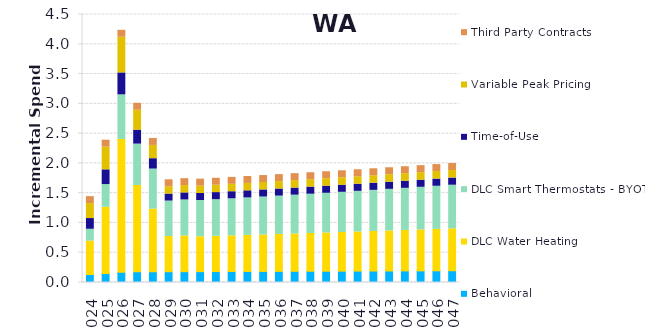
| Category | Behavioral | DLC Water Heating | DLC Smart Thermostats - BYOT | Time-of-Use | Variable Peak Pricing | Third Party Contracts |
|---|---|---|---|---|---|---|
| 2024.0 | 0.134 | 0.562 | 0.198 | 0.18 | 0.251 | 0.117 |
| 2025.0 | 0.15 | 1.113 | 0.38 | 0.248 | 0.381 | 0.117 |
| 2026.0 | 0.172 | 2.23 | 0.749 | 0.368 | 0.599 | 0.117 |
| 2027.0 | 0.18 | 1.448 | 0.695 | 0.234 | 0.334 | 0.117 |
| 2028.0 | 0.18 | 1.052 | 0.673 | 0.174 | 0.223 | 0.117 |
| 2029.0 | 0.181 | 0.59 | 0.596 | 0.118 | 0.123 | 0.117 |
| 2030.0 | 0.182 | 0.599 | 0.605 | 0.118 | 0.123 | 0.117 |
| 2031.0 | 0.183 | 0.586 | 0.608 | 0.118 | 0.124 | 0.117 |
| 2032.0 | 0.183 | 0.592 | 0.615 | 0.118 | 0.124 | 0.117 |
| 2033.0 | 0.184 | 0.599 | 0.622 | 0.119 | 0.124 | 0.117 |
| 2034.0 | 0.185 | 0.606 | 0.629 | 0.119 | 0.124 | 0.117 |
| 2035.0 | 0.186 | 0.613 | 0.637 | 0.119 | 0.124 | 0.117 |
| 2036.0 | 0.187 | 0.62 | 0.644 | 0.119 | 0.125 | 0.117 |
| 2037.0 | 0.188 | 0.627 | 0.652 | 0.119 | 0.125 | 0.117 |
| 2038.0 | 0.189 | 0.634 | 0.659 | 0.119 | 0.125 | 0.117 |
| 2039.0 | 0.19 | 0.642 | 0.667 | 0.119 | 0.125 | 0.117 |
| 2040.0 | 0.191 | 0.649 | 0.675 | 0.119 | 0.125 | 0.117 |
| 2041.0 | 0.192 | 0.657 | 0.683 | 0.119 | 0.126 | 0.117 |
| 2042.0 | 0.192 | 0.664 | 0.691 | 0.12 | 0.126 | 0.117 |
| 2043.0 | 0.193 | 0.672 | 0.699 | 0.12 | 0.126 | 0.117 |
| 2044.0 | 0.194 | 0.68 | 0.707 | 0.12 | 0.126 | 0.117 |
| 2045.0 | 0.195 | 0.688 | 0.715 | 0.12 | 0.126 | 0.117 |
| 2046.0 | 0.196 | 0.696 | 0.724 | 0.12 | 0.127 | 0.117 |
| 2047.0 | 0.197 | 0.704 | 0.732 | 0.12 | 0.127 | 0.117 |